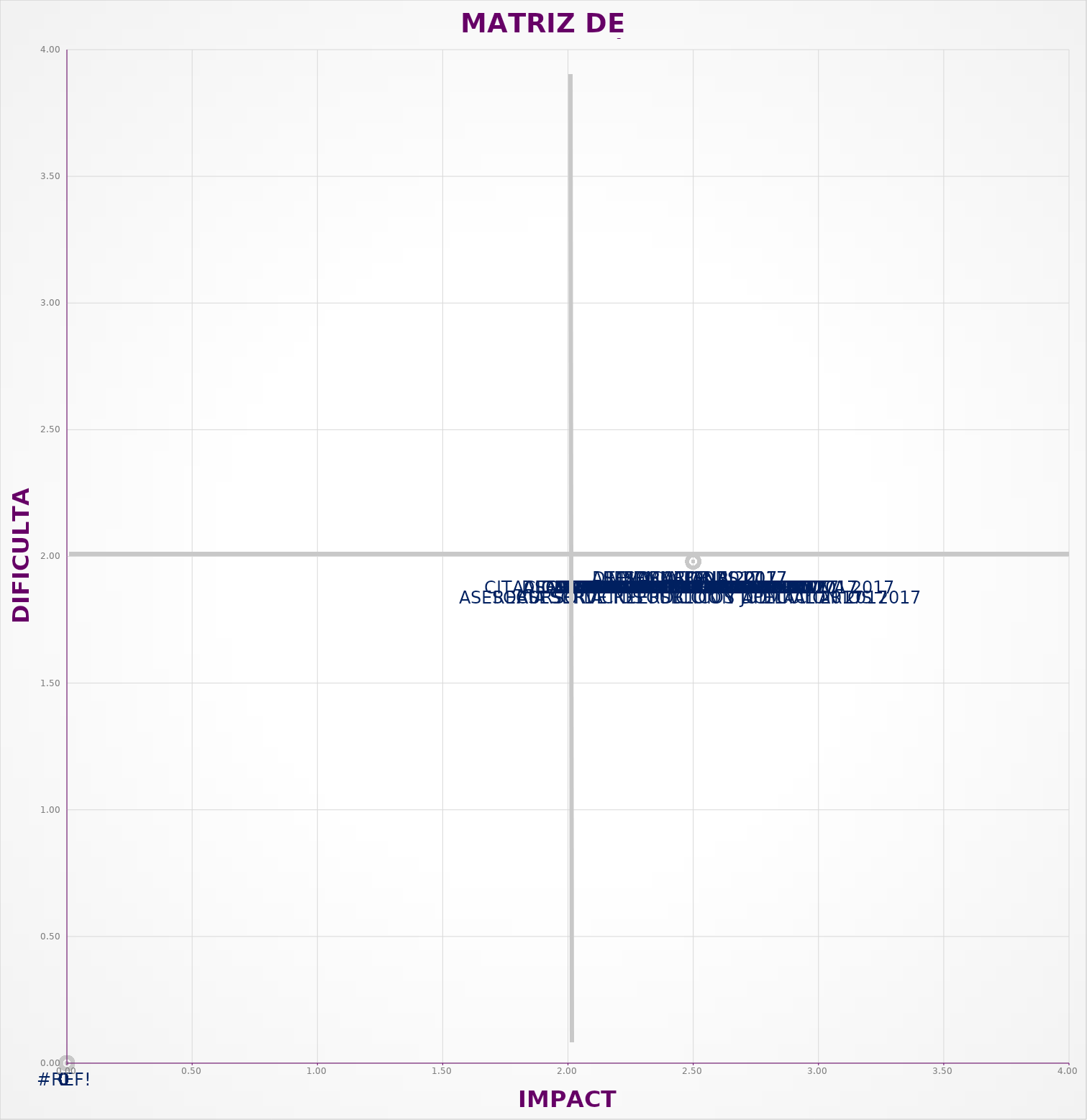
| Category | Series 0 |
|---|---|
| 2.5 | 1.98 |
| 2.5 | 1.98 |
| 2.5 | 1.98 |
| 2.5 | 1.98 |
| 2.5 | 1.98 |
| 2.5 | 1.98 |
| 2.5 | 1.98 |
| 2.5 | 1.98 |
| 2.5 | 1.98 |
| 2.5 | 1.98 |
| 2.5 | 1.98 |
| 2.5 | 1.98 |
| 2.5 | 1.98 |
| 2.5 | 1.98 |
| 2.5 | 1.98 |
| 2.5 | 1.98 |
| 2.5 | 1.98 |
| 2.5 | 1.98 |
| 2.5 | 1.98 |
| 2.5 | 1.98 |
| 2.5 | 1.98 |
| 2.5 | 1.98 |
| 2.5 | 1.98 |
| 2.5 | 1.98 |
| 2.5 | 1.98 |
| 2.5 | 1.98 |
| 2.5 | 1.98 |
| 0.0 | 0 |
| 0.0 | 0 |
| 0.0 | 0 |
| 0.0 | 0 |
| 0.0 | 0 |
| 0.0 | 0 |
| 0.0 | 0 |
| 0.0 | 0 |
| 0.0 | 0 |
| 0.0 | 0 |
| 0.0 | 0 |
| 0.0 | 0 |
| 0.0 | 0 |
| 0.0 | 0 |
| 0.0 | 0 |
| 0.0 | 0 |
| 0.0 | 0 |
| 0.0 | 0 |
| 0.0 | 0 |
| 0.0 | 0 |
| 0.0 | 0 |
| 0.0 | 0 |
| 0.0 | 0 |
| 0.0 | 0 |
| 0.0 | 0 |
| 0.0 | 0 |
| 0.0 | 0 |
| 0.0 | 0 |
| 0.0 | 0 |
| 0.0 | 0 |
| 0.0 | 0 |
| 0.0 | 0 |
| 0.0 | 0 |
| 0.0 | 0 |
| 0.0 | 0 |
| 0.0 | 0 |
| 0.0 | 0 |
| 0.0 | 0 |
| 0.0 | 0 |
| 0.0 | 0 |
| 0.0 | 0 |
| 0.0 | 0 |
| 0.0 | 0 |
| 0.0 | 0 |
| 0.0 | 0 |
| 0.0 | 0 |
| 0.0 | 0 |
| 0.0 | 0 |
| 0.0 | 0 |
| 0.0 | 0 |
| 0.0 | 0 |
| 0.0 | 0 |
| 0.0 | 0 |
| 0.0 | 0 |
| 0.0 | 0 |
| 0.0 | 0 |
| 0.0 | 0 |
| 0.0 | 0 |
| 0.0 | 0 |
| 0.0 | 0 |
| 0.0 | 0 |
| 0.0 | 0 |
| 0.0 | 0 |
| 0.0 | 0 |
| 0.0 | 0 |
| 0.0 | 0 |
| 0.0 | 0 |
| 0.0 | 0 |
| 0.0 | 0 |
| 0.0 | 0 |
| 0.0 | 0 |
| 0.0 | 0 |
| 0.0 | 0 |
| 0.0 | 0 |
| 0.0 | 0 |
| 0.0 | 0 |
| 0.0 | 0 |
| 0.0 | 0 |
| 0.0 | 0 |
| 0.0 | 0 |
| 0.0 | 0 |
| 0.0 | 0 |
| 0.0 | 0 |
| 0.0 | 0 |
| 0.0 | 0 |
| 0.0 | 0 |
| 0.0 | 0 |
| 0.0 | 0 |
| 0.0 | 0 |
| 0.0 | 0 |
| 0.0 | 0 |
| 0.0 | 0 |
| 0.0 | 0 |
| 0.0 | 0 |
| 0.0 | 0 |
| 0.0 | 0 |
| 0.0 | 0 |
| 0.0 | 0 |
| 0.0 | 0 |
| 0.0 | 0 |
| 0.0 | 0 |
| 0.0 | 0 |
| 0.0 | 0 |
| 0.0 | 0 |
| 0.0 | 0 |
| 0.0 | 0 |
| 0.0 | 0 |
| 0.0 | 0 |
| 0.0 | 0 |
| 0.0 | 0 |
| 0.0 | 0 |
| 0.0 | 0 |
| 0.0 | 0 |
| 0.0 | 0 |
| 0.0 | 0 |
| 0.0 | 0 |
| 0.0 | 0 |
| 0.0 | 0 |
| 0.0 | 0 |
| 0.0 | 0 |
| 0.0 | 0 |
| 0.0 | 0 |
| 0.0 | 0 |
| 0.0 | 0 |
| 0.0 | 0 |
| 0.0 | 0 |
| 0.0 | 0 |
| 0.0 | 0 |
| 0.0 | 0 |
| 0.0 | 0 |
| 0.0 | 0 |
| 0.0 | 0 |
| 0.0 | 0 |
| 0.0 | 0 |
| 0.0 | 0 |
| 0.0 | 0 |
| 0.0 | 0 |
| 0.0 | 0 |
| 0.0 | 0 |
| 0.0 | 0 |
| 0.0 | 0 |
| 0.0 | 0 |
| 0.0 | 0 |
| 0.0 | 0 |
| 0.0 | 0 |
| 0.0 | 0 |
| 0.0 | 0 |
| 0.0 | 0 |
| 0.0 | 0 |
| 0.0 | 0 |
| 0.0 | 0 |
| 0.0 | 0 |
| 0.0 | 0 |
| 0.0 | 0 |
| 0.0 | 0 |
| 0.0 | 0 |
| 0.0 | 0 |
| 0.0 | 0 |
| 0.0 | 0 |
| 0.0 | 0 |
| 0.0 | 0 |
| 0.0 | 0 |
| 0.0 | 0 |
| 0.0 | 0 |
| 0.0 | 0 |
| 0.0 | 0 |
| 0.0 | 0 |
| 0.0 | 0 |
| 0.0 | 0 |
| 0.0 | 0 |
| 0.0 | 0 |
| 0.0 | 0 |
| 0.0 | 0 |
| 0.0 | 0 |
| 0.0 | 0 |
| 0.0 | 0 |
| 0.0 | 0 |
| 0.0 | 0 |
| 0.0 | 0 |
| 0.0 | 0 |
| 0.0 | 0 |
| 0.0 | 0 |
| 0.0 | 0 |
| 0.0 | 0 |
| 0.0 | 0 |
| 0.0 | 0 |
| 0.0 | 0 |
| 0.0 | 0 |
| 0.0 | 0 |
| 0.0 | 0 |
| 0.0 | 0 |
| 0.0 | 0 |
| 0.0 | 0 |
| 0.0 | 0 |
| 0.0 | 0 |
| 0.0 | 0 |
| 0.0 | 0 |
| 0.0 | 0 |
| 0.0 | 0 |
| 0.0 | 0 |
| 0.0 | 0 |
| 0.0 | 0 |
| 0.0 | 0 |
| 0.0 | 0 |
| 0.0 | 0 |
| 0.0 | 0 |
| 0.0 | 0 |
| 0.0 | 0 |
| 0.0 | 0 |
| 0.0 | 0 |
| 0.0 | 0 |
| 0.0 | 0 |
| 0.0 | 0 |
| 0.0 | 0 |
| 0.0 | 0 |
| 0.0 | 0 |
| 0.0 | 0 |
| 0.0 | 0 |
| 0.0 | 0 |
| 0.0 | 0 |
| 0.0 | 0 |
| 0.0 | 0 |
| 0.0 | 0 |
| 0.0 | 0 |
| 0.0 | 0 |
| 0.0 | 0 |
| 0.0 | 0 |
| 0.0 | 0 |
| 0.0 | 0 |
| 0.0 | 0 |
| 0.0 | 0 |
| 0.0 | 0 |
| 0.0 | 0 |
| 0.0 | 0 |
| 0.0 | 0 |
| 0.0 | 0 |
| 0.0 | 0 |
| 0.0 | 0 |
| 0.0 | 0 |
| 0.0 | 0 |
| 0.0 | 0 |
| 0.0 | 0 |
| 0.0 | 0 |
| 0.0 | 0 |
| 0.0 | 0 |
| 0.0 | 0 |
| 0.0 | 0 |
| 0.0 | 0 |
| 0.0 | 0 |
| 0.0 | 0 |
| 0.0 | 0 |
| 0.0 | 0 |
| 0.0 | 0 |
| 0.0 | 0 |
| 0.0 | 0 |
| 0.0 | 0 |
| 0.0 | 0 |
| 0.0 | 0 |
| 0.0 | 0 |
| 0.0 | 0 |
| 0.0 | 0 |
| 0.0 | 0 |
| 0.0 | 0 |
| 0.0 | 0 |
| 0.0 | 0 |
| 0.0 | 0 |
| 0.0 | 0 |
| 0.0 | 0 |
| 0.0 | 0 |
| 0.0 | 0 |
| 0.0 | 0 |
| 0.0 | 0 |
| 0.0 | 0 |
| 0.0 | 0 |
| 0.0 | 0 |
| 0.0 | 0 |
| 0.0 | 0 |
| 0.0 | 0 |
| 0.0 | 0 |
| 0.0 | 0 |
| 0.0 | 0 |
| 0.0 | 0 |
| 0.0 | 0 |
| 0.0 | 0 |
| 0.0 | 0 |
| 0.0 | 0 |
| 0.0 | 0 |
| 0.0 | 0 |
| 0.0 | 0 |
| 0.0 | 0 |
| 0.0 | 0 |
| 0.0 | 0 |
| 0.0 | 0 |
| 0.0 | 0 |
| 0.0 | 0 |
| 0.0 | 0 |
| 0.0 | 0 |
| 0.0 | 0 |
| 0.0 | 0 |
| 0.0 | 0 |
| 0.0 | 0 |
| 0.0 | 0 |
| 0.0 | 0 |
| 0.0 | 0 |
| 0.0 | 0 |
| 0.0 | 0 |
| 0.0 | 0 |
| 0.0 | 0 |
| 0.0 | 0 |
| 0.0 | 0 |
| 0.0 | 0 |
| 0.0 | 0 |
| 0.0 | 0 |
| 0.0 | 0 |
| 0.0 | 0 |
| 0.0 | 0 |
| 0.0 | 0 |
| 0.0 | 0 |
| 0.0 | 0 |
| 0.0 | 0 |
| 0.0 | 0 |
| 0.0 | 0 |
| 0.0 | 0 |
| 0.0 | 0 |
| 0.0 | 0 |
| 0.0 | 0 |
| 0.0 | 0 |
| 0.0 | 0 |
| 0.0 | 0 |
| 0.0 | 0 |
| 0.0 | 0 |
| 0.0 | 0 |
| 0.0 | 0 |
| 0.0 | 0 |
| 0.0 | 0 |
| 0.0 | 0 |
| 0.0 | 0 |
| 0.0 | 0 |
| 0.0 | 0 |
| 0.0 | 0 |
| 0.0 | 0 |
| 0.0 | 0 |
| 0.0 | 0 |
| 0.0 | 0 |
| 0.0 | 0 |
| 0.0 | 0 |
| 0.0 | 0 |
| 0.0 | 0 |
| 0.0 | 0 |
| 0.0 | 0 |
| 0.0 | 0 |
| 0.0 | 0 |
| 0.0 | 0 |
| 0.0 | 0 |
| 0.0 | 0 |
| 0.0 | 0 |
| 0.0 | 0 |
| 0.0 | 0 |
| 0.0 | 0 |
| 0.0 | 0 |
| 0.0 | 0 |
| 0.0 | 0 |
| 0.0 | 0 |
| 0.0 | 0 |
| 0.0 | 0 |
| 0.0 | 0 |
| 0.0 | 0 |
| 0.0 | 0 |
| 0.0 | 0 |
| 0.0 | 0 |
| 0.0 | 0 |
| 0.0 | 0 |
| 0.0 | 0 |
| 0.0 | 0 |
| 0.0 | 0 |
| 0.0 | 0 |
| 0.0 | 0 |
| 0.0 | 0 |
| 0.0 | 0 |
| 0.0 | 0 |
| 0.0 | 0 |
| 0.0 | 0 |
| 0.0 | 0 |
| 0.0 | 0 |
| 0.0 | 0 |
| 0.0 | 0 |
| 0.0 | 0 |
| 0.0 | 0 |
| 0.0 | 0 |
| 0.0 | 0 |
| 0.0 | 0 |
| 0.0 | 0 |
| 0.0 | 0 |
| 0.0 | 0 |
| 0.0 | 0 |
| 0.0 | 0 |
| 0.0 | 0 |
| 0.0 | 0 |
| 0.0 | 0 |
| 0.0 | 0 |
| 0.0 | 0 |
| 0.0 | 0 |
| 0.0 | 0 |
| 0.0 | 0 |
| 0.0 | 0 |
| 0.0 | 0 |
| 0.0 | 0 |
| 0.0 | 0 |
| 0.0 | 0 |
| 0.0 | 0 |
| 0.0 | 0 |
| 0.0 | 0 |
| 0.0 | 0 |
| 0.0 | 0 |
| 0.0 | 0 |
| 0.0 | 0 |
| 0.0 | 0 |
| 0.0 | 0 |
| 0.0 | 0 |
| 0.0 | 0 |
| 0.0 | 0 |
| 0.0 | 0 |
| 0.0 | 0 |
| 0.0 | 0 |
| 0.0 | 0 |
| 0.0 | 0 |
| 0.0 | 0 |
| 0.0 | 0 |
| 0.0 | 0 |
| 0.0 | 0 |
| 0.0 | 0 |
| 0.0 | 0 |
| 0.0 | 0 |
| 0.0 | 0 |
| 0.0 | 0 |
| 0.0 | 0 |
| 0.0 | 0 |
| 0.0 | 0 |
| 0.0 | 0 |
| 0.0 | 0 |
| 0.0 | 0 |
| 0.0 | 0 |
| 0.0 | 0 |
| 0.0 | 0 |
| 0.0 | 0 |
| 0.0 | 0 |
| 0.0 | 0 |
| 0.0 | 0 |
| 0.0 | 0 |
| 0.0 | 0 |
| 0.0 | 0 |
| 0.0 | 0 |
| 0.0 | 0 |
| 0.0 | 0 |
| 0.0 | 0 |
| 0.0 | 0 |
| 0.0 | 0 |
| 0.0 | 0 |
| 0.0 | 0 |
| 0.0 | 0 |
| 0.0 | 0 |
| 0.0 | 0 |
| 0.0 | 0 |
| 0.0 | 0 |
| 0.0 | 0 |
| 0.0 | 0 |
| 0.0 | 0 |
| 0.0 | 0 |
| 0.0 | 0 |
| 0.0 | 0 |
| 0.0 | 0 |
| 0.0 | 0 |
| 0.0 | 0 |
| 0.0 | 0 |
| 0.0 | 0 |
| 0.0 | 0 |
| 0.0 | 0 |
| 0.0 | 0 |
| 0.0 | 0 |
| 0.0 | 0 |
| 0.0 | 0 |
| 0.0 | 0 |
| 0.0 | 0 |
| 0.0 | 0 |
| 0.0 | 0 |
| 0.0 | 0 |
| 0.0 | 0 |
| 0.0 | 0 |
| 0.0 | 0 |
| 0.0 | 0 |
| 0.0 | 0 |
| 0.0 | 0 |
| 0.0 | 0 |
| 0.0 | 0 |
| 0.0 | 0 |
| 0.0 | 0 |
| 0.0 | 0 |
| 0.0 | 0 |
| 0.0 | 0 |
| 0.0 | 0 |
| 0.0 | 0 |
| 0.0 | 0 |
| 0.0 | 0 |
| 0.0 | 0 |
| 0.0 | 0 |
| 0.0 | 0 |
| 0.0 | 0 |
| 0.0 | 0 |
| 0.0 | 0 |
| 0.0 | 0 |
| 0.0 | 0 |
| 0.0 | 0 |
| 0.0 | 0 |
| 0.0 | 0 |
| 0.0 | 0 |
| 0.0 | 0 |
| 0.0 | 0 |
| 0.0 | 0 |
| 0.0 | 0 |
| 0.0 | 0 |
| 0.0 | 0 |
| 0.0 | 0 |
| 0.0 | 0 |
| 0.0 | 0 |
| 0.0 | 0 |
| 0.0 | 0 |
| 0.0 | 0 |
| 0.0 | 0 |
| 0.0 | 0 |
| 0.0 | 0 |
| 0.0 | 0 |
| 0.0 | 0 |
| 0.0 | 0 |
| 0.0 | 0 |
| 0.0 | 0 |
| 0.0 | 0 |
| 0.0 | 0 |
| 0.0 | 0 |
| 0.0 | 0 |
| 0.0 | 0 |
| 0.0 | 0 |
| 0.0 | 0 |
| 0.0 | 0 |
| 0.0 | 0 |
| 0.0 | 0 |
| 0.0 | 0 |
| 0.0 | 0 |
| 0.0 | 0 |
| 0.0 | 0 |
| 0.0 | 0 |
| 0.0 | 0 |
| 0.0 | 0 |
| 0.0 | 0 |
| 0.0 | 0 |
| 0.0 | 0 |
| 0.0 | 0 |
| 0.0 | 0 |
| 0.0 | 0 |
| 0.0 | 0 |
| 0.0 | 0 |
| 0.0 | 0 |
| 0.0 | 0 |
| 0.0 | 0 |
| 0.0 | 0 |
| 0.0 | 0 |
| 0.0 | 0 |
| 0.0 | 0 |
| 0.0 | 0 |
| 0.0 | 0 |
| 0.0 | 0 |
| 0.0 | 0 |
| 0.0 | 0 |
| 0.0 | 0 |
| 0.0 | 0 |
| 0.0 | 0 |
| 0.0 | 0 |
| 0.0 | 0 |
| 0.0 | 0 |
| 0.0 | 0 |
| 0.0 | 0 |
| 0.0 | 0 |
| 0.0 | 0 |
| 0.0 | 0 |
| 0.0 | 0 |
| 0.0 | 0 |
| 0.0 | 0 |
| 0.0 | 0 |
| 0.0 | 0 |
| 0.0 | 0 |
| 0.0 | 0 |
| 0.0 | 0 |
| 0.0 | 0 |
| 0.0 | 0 |
| 0.0 | 0 |
| 0.0 | 0 |
| 0.0 | 0 |
| 0.0 | 0 |
| 0.0 | 0 |
| 0.0 | 0 |
| 0.0 | 0 |
| 0.0 | 0 |
| 0.0 | 0 |
| 0.0 | 0 |
| 0.0 | 0 |
| 0.0 | 0 |
| 0.0 | 0 |
| 0.0 | 0 |
| 0.0 | 0 |
| 0.0 | 0 |
| 0.0 | 0 |
| 0.0 | 0 |
| 0.0 | 0 |
| 0.0 | 0 |
| 0.0 | 0 |
| 0.0 | 0 |
| 0.0 | 0 |
| 0.0 | 0 |
| 0.0 | 0 |
| 0.0 | 0 |
| 0.0 | 0 |
| 0.0 | 0 |
| 0.0 | 0 |
| 0.0 | 0 |
| 0.0 | 0 |
| 0.0 | 0 |
| 0.0 | 0 |
| 0.0 | 0 |
| 0.0 | 0 |
| 0.0 | 0 |
| 0.0 | 0 |
| 0.0 | 0 |
| 0.0 | 0 |
| 0.0 | 0 |
| 0.0 | 0 |
| 0.0 | 0 |
| 0.0 | 0 |
| 0.0 | 0 |
| 0.0 | 0 |
| 0.0 | 0 |
| 0.0 | 0 |
| 0.0 | 0 |
| 0.0 | 0 |
| 0.0 | 0 |
| 0.0 | 0 |
| 0.0 | 0 |
| 0.0 | 0 |
| 0.0 | 0 |
| 0.0 | 0 |
| 0.0 | 0 |
| 0.0 | 0 |
| 0.0 | 0 |
| 0.0 | 0 |
| 0.0 | 0 |
| 0.0 | 0 |
| 0.0 | 0 |
| 0.0 | 0 |
| 0.0 | 0 |
| 0.0 | 0 |
| 0.0 | 0 |
| 0.0 | 0 |
| 0.0 | 0 |
| 0.0 | 0 |
| 0.0 | 0 |
| 0.0 | 0 |
| 0.0 | 0 |
| 0.0 | 0 |
| 0.0 | 0 |
| 0.0 | 0 |
| 0.0 | 0 |
| 0.0 | 0 |
| 0.0 | 0 |
| 0.0 | 0 |
| 0.0 | 0 |
| 0.0 | 0 |
| 0.0 | 0 |
| 0.0 | 0 |
| 0.0 | 0 |
| 0.0 | 0 |
| 0.0 | 0 |
| 0.0 | 0 |
| 0.0 | 0 |
| 0.0 | 0 |
| 0.0 | 0 |
| 0.0 | 0 |
| 0.0 | 0 |
| 0.0 | 0 |
| 0.0 | 0 |
| 0.0 | 0 |
| 0.0 | 0 |
| 0.0 | 0 |
| 0.0 | 0 |
| 0.0 | 0 |
| 0.0 | 0 |
| 0.0 | 0 |
| 0.0 | 0 |
| 0.0 | 0 |
| 0.0 | 0 |
| 0.0 | 0 |
| 0.0 | 0 |
| 0.0 | 0 |
| 0.0 | 0 |
| 0.0 | 0 |
| 0.0 | 0 |
| 0.0 | 0 |
| 0.0 | 0 |
| 0.0 | 0 |
| 0.0 | 0 |
| 0.0 | 0 |
| 0.0 | 0 |
| 0.0 | 0 |
| 0.0 | 0 |
| 0.0 | 0 |
| 0.0 | 0 |
| 0.0 | 0 |
| 0.0 | 0 |
| 0.0 | 0 |
| 0.0 | 0 |
| 0.0 | 0 |
| 0.0 | 0 |
| 0.0 | 0 |
| 0.0 | 0 |
| 0.0 | 0 |
| 0.0 | 0 |
| 0.0 | 0 |
| 0.0 | 0 |
| 0.0 | 0 |
| 0.0 | 0 |
| 0.0 | 0 |
| 0.0 | 0 |
| 0.0 | 0 |
| 0.0 | 0 |
| 0.0 | 0 |
| 0.0 | 0 |
| 0.0 | 0 |
| 0.0 | 0 |
| 0.0 | 0 |
| 0.0 | 0 |
| 0.0 | 0 |
| 0.0 | 0 |
| 0.0 | 0 |
| 0.0 | 0 |
| 0.0 | 0 |
| 0.0 | 0 |
| 0.0 | 0 |
| 0.0 | 0 |
| 0.0 | 0 |
| 0.0 | 0 |
| 0.0 | 0 |
| 0.0 | 0 |
| 0.0 | 0 |
| 0.0 | 0 |
| 0.0 | 0 |
| 0.0 | 0 |
| 0.0 | 0 |
| 0.0 | 0 |
| 0.0 | 0 |
| 0.0 | 0 |
| 0.0 | 0 |
| 0.0 | 0 |
| 0.0 | 0 |
| 0.0 | 0 |
| 0.0 | 0 |
| 0.0 | 0 |
| 0.0 | 0 |
| 0.0 | 0 |
| 0.0 | 0 |
| 0.0 | 0 |
| 0.0 | 0 |
| 0.0 | 0 |